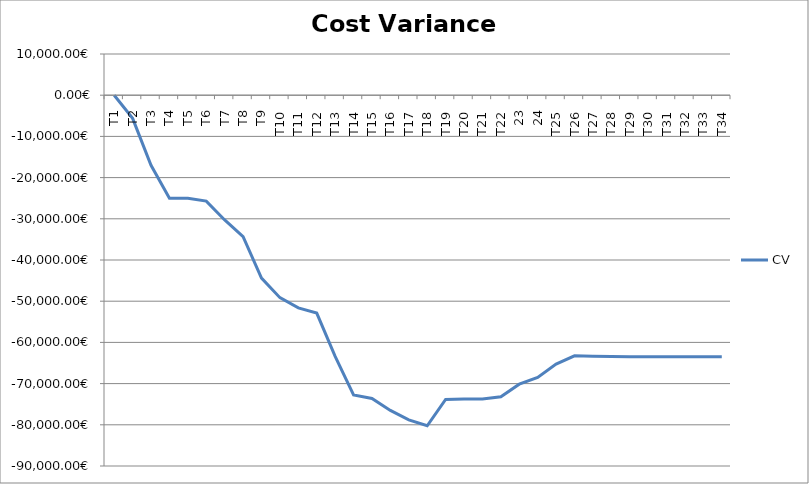
| Category | CV |
|---|---|
| T1 | 0 |
| T2 | -5625 |
| T3 | -17000 |
| T4 | -25000 |
| T5 | -25000 |
| T6 | -25703.248 |
| T7 | -30273.52 |
| T8 | -34330.081 |
| T9 | -44390.796 |
| T10 | -49140.796 |
| T11 | -51607.344 |
| T12 | -52890.205 |
| T13 | -63395.299 |
| T14 | -72751.648 |
| T15 | -73617.839 |
| T16 | -76513.084 |
| T17 | -78795.943 |
| T18 | -80240.738 |
| T19 | -73841.482 |
| T20 | -73746.914 |
| T21 | -73746.914 |
| T22 | -73177.465 |
| 23 | -70139.189 |
| 24 | -68484.002 |
| T25 | -65274.949 |
| T26 | -63268.166 |
| T27 | -63347.447 |
| T28 | -63423.593 |
| T29 | -63488.317 |
| T30 | -63488.317 |
| T31 | -63488.317 |
| T32 | -63488.317 |
| T33 | -63488.317 |
| T34 | -63488.317 |